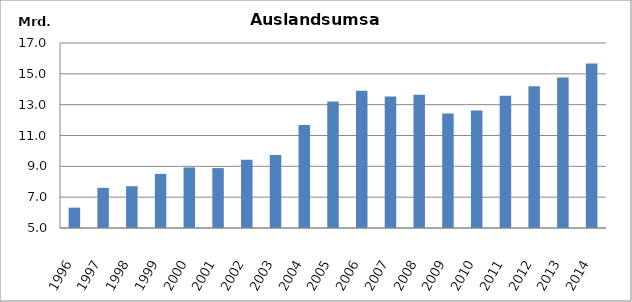
| Category | darunter
Auslandsumsatz |
|---|---|
| 1996.0 | 6319142 |
| 1997.0 | 7603819 |
| 1998.0 | 7711587 |
| 1999.0 | 8508603 |
| 2000.0 | 8925754 |
| 2001.0 | 8885463 |
| 2002.0 | 9428713 |
| 2003.0 | 9733339 |
| 2004.0 | 11680546 |
| 2005.0 | 13208153 |
| 2006.0 | 13901521 |
| 2007.0 | 13537187 |
| 2008.0 | 13649884 |
| 2009.0 | 12432618 |
| 2010.0 | 12628416.402 |
| 2011.0 | 13577795 |
| 2012.0 | 14199097.02 |
| 2013.0 | 14765099.402 |
| 2014.0 | 15677925.464 |